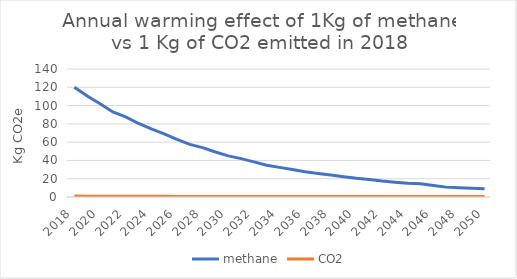
| Category | methane | CO2 |
|---|---|---|
| 2018.0 | 120 | 1 |
| 2019.0 | 110.4 | 0.875 |
| 2020.0 | 102 | 0.81 |
| 2021.0 | 93 | 0.775 |
| 2022.0 | 87.6 | 0.75 |
| 2023.0 | 80.4 | 0.73 |
| 2024.0 | 74.4 | 0.72 |
| 2025.0 | 69 | 0.7 |
| 2026.0 | 63 | 0.68 |
| 2027.0 | 57.6 | 0.675 |
| 2028.0 | 54 | 0.665 |
| 2029.0 | 49.2 | 0.65 |
| 2030.0 | 45 | 0.64 |
| 2031.0 | 42 | 0.63 |
| 2032.0 | 38.4 | 0.625 |
| 2033.0 | 34.8 | 0.61 |
| 2034.0 | 32.4 | 0.595 |
| 2035.0 | 30 | 0.585 |
| 2036.0 | 27.6 | 0.575 |
| 2037.0 | 25.8 | 0.57 |
| 2038.0 | 24 | 0.565 |
| 2039.0 | 22.2 | 0.555 |
| 2040.0 | 20.4 | 0.55 |
| 2041.0 | 19.2 | 0.545 |
| 2042.0 | 17.4 | 0.54 |
| 2043.0 | 16.2 | 0.53 |
| 2044.0 | 15 | 0.525 |
| 2045.0 | 14.4 | 0.52 |
| 2046.0 | 12.6 | 0.515 |
| 2047.0 | 10.8 | 0.51 |
| 2048.0 | 10.2 | 0.5 |
| 2049.0 | 9.6 | 0.495 |
| 2050.0 | 9 | 0.49 |